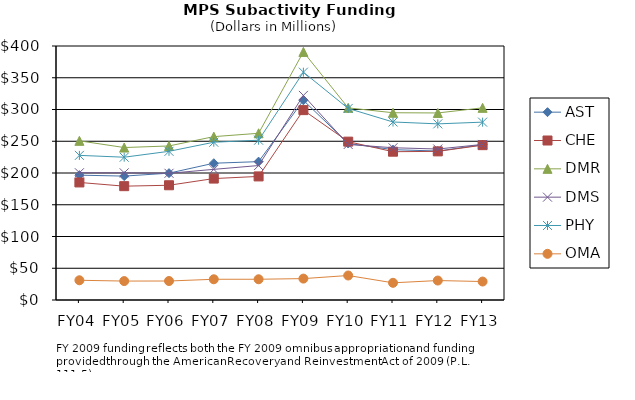
| Category | AST | CHE | DMR | DMS | PHY | OMA |
|---|---|---|---|---|---|---|
| FY04 | 196.628 | 185.118 | 250.65 | 200.349 | 227.774 | 31.073 |
| FY05 | 195.11 | 179.26 | 240.09 | 200.24 | 224.86 | 29.8 |
| FY06 | 199.75 | 180.7 | 242.59 | 199.52 | 234.15 | 29.9 |
| FY07 | 215.391 | 191.22 | 257.27 | 205.74 | 248.47 | 32.64 |
| FY08 | 217.901 | 194.623 | 262.547 | 211.752 | 251.639 | 32.671 |
| FY09 | 314.47 | 299.03 | 390.69 | 322.18 | 358.77 | 33.7 |
| FY10 | 246.53 | 249.38 | 302.57 | 244.92 | 301.66 | 38.58 |
| FY11 | 236.784 | 233.548 | 294.906 | 239.786 | 280.338 | 27.061 |
| FY12 | 234.55 | 234.06 | 294.55 | 237.77 | 277.37 | 30.64 |
| FY13 | 244.55 | 243.85 | 302.63 | 245 | 280.08 | 29.07 |